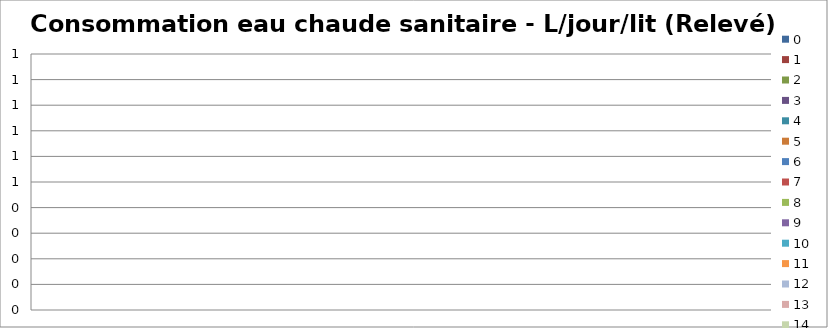
| Category | 0 | 1 | 2 | 3 | 4 | 5 | 6 | 7 | 8 | 9 | 10 | 11 | 12 | 13 | 14 |
|---|---|---|---|---|---|---|---|---|---|---|---|---|---|---|---|
| TOTAL - L/jour/lit | 0 | 0 | 0 | 0 | 0 | 0 | 0 | 0 | 0 | 0 | 0 | 0 | 0 | 0 | 0 |